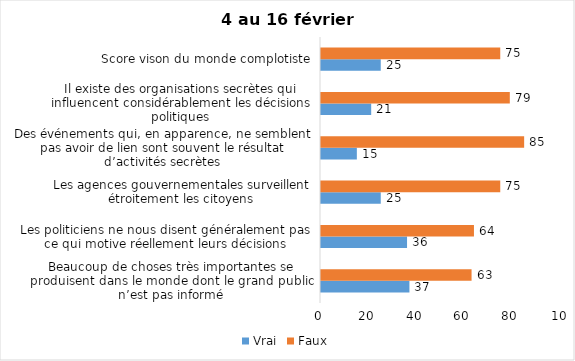
| Category | Vrai | Faux |
|---|---|---|
| Beaucoup de choses très importantes se produisent dans le monde dont le grand public n’est pas informé | 37 | 63 |
| Les politiciens ne nous disent généralement pas ce qui motive réellement leurs décisions | 36 | 64 |
| Les agences gouvernementales surveillent étroitement les citoyens | 25 | 75 |
| Des événements qui, en apparence, ne semblent pas avoir de lien sont souvent le résultat d’activités secrètes | 15 | 85 |
| Il existe des organisations secrètes qui influencent considérablement les décisions politiques | 21 | 79 |
| Score vison du monde complotiste | 25 | 75 |